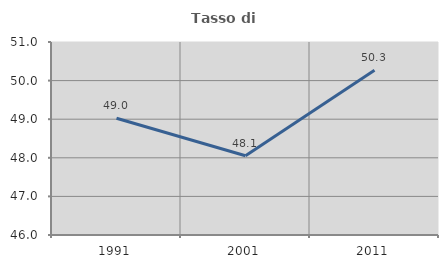
| Category | Tasso di occupazione   |
|---|---|
| 1991.0 | 49.025 |
| 2001.0 | 48.052 |
| 2011.0 | 50.269 |